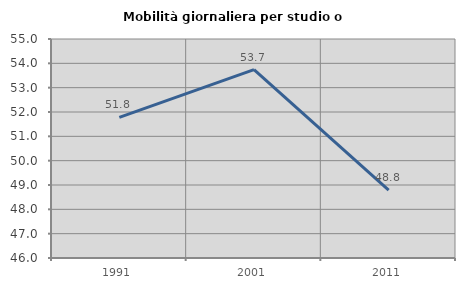
| Category | Mobilità giornaliera per studio o lavoro |
|---|---|
| 1991.0 | 51.777 |
| 2001.0 | 53.739 |
| 2011.0 | 48.794 |